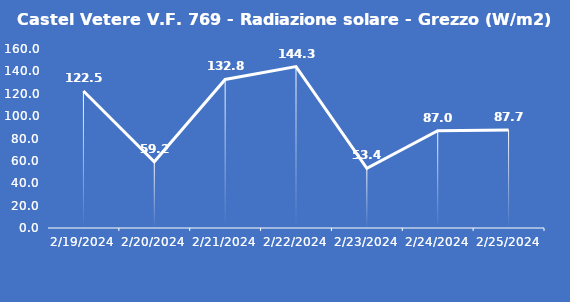
| Category | Castel Vetere V.F. 769 - Radiazione solare - Grezzo (W/m2) |
|---|---|
| 2/19/24 | 122.5 |
| 2/20/24 | 59.2 |
| 2/21/24 | 132.8 |
| 2/22/24 | 144.3 |
| 2/23/24 | 53.4 |
| 2/24/24 | 87 |
| 2/25/24 | 87.7 |